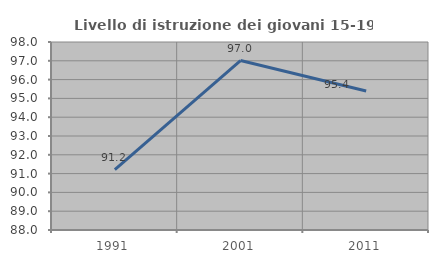
| Category | Livello di istruzione dei giovani 15-19 anni |
|---|---|
| 1991.0 | 91.218 |
| 2001.0 | 97.015 |
| 2011.0 | 95.393 |